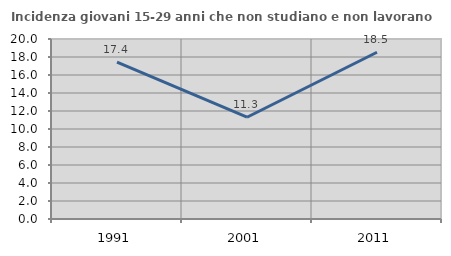
| Category | Incidenza giovani 15-29 anni che non studiano e non lavorano  |
|---|---|
| 1991.0 | 17.442 |
| 2001.0 | 11.307 |
| 2011.0 | 18.527 |